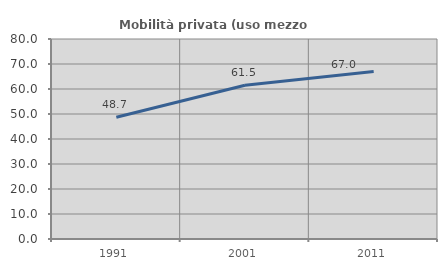
| Category | Mobilità privata (uso mezzo privato) |
|---|---|
| 1991.0 | 48.688 |
| 2001.0 | 61.506 |
| 2011.0 | 66.994 |